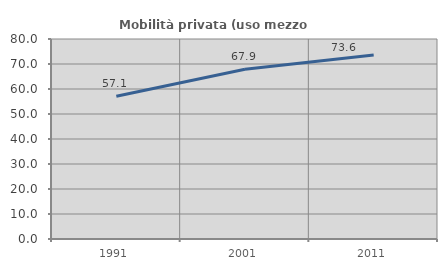
| Category | Mobilità privata (uso mezzo privato) |
|---|---|
| 1991.0 | 57.114 |
| 2001.0 | 67.93 |
| 2011.0 | 73.627 |